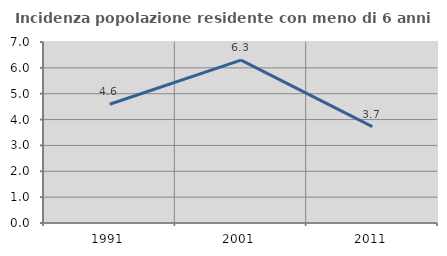
| Category | Incidenza popolazione residente con meno di 6 anni |
|---|---|
| 1991.0 | 4.594 |
| 2001.0 | 6.298 |
| 2011.0 | 3.73 |